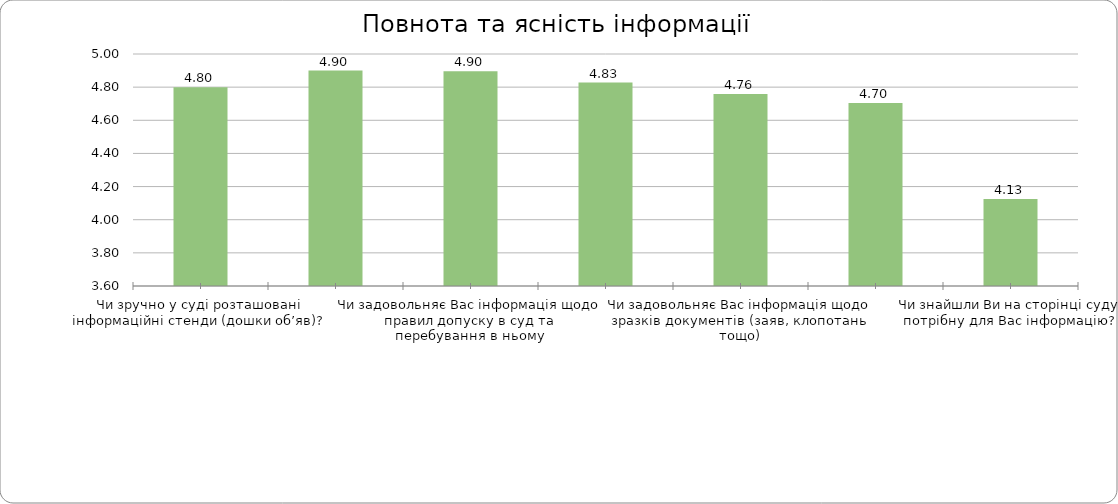
| Category | Series 0 |
|---|---|
| Чи зручно у суді розташовані інформаційні стенди (дошки об’яв)? | 4.8 |
| Чи задовольняє Вас інформація щодо розташування кабінетів, залів судових засідань, інших приміщень | 4.9 |
| Чи задовольняє Вас інформація щодо правил допуску в суд та перебування в ньому | 4.897 |
| Чи задовольняє Вас інформація щодо справ, що призначені до розгляду | 4.828 |
| Чи задовольняє Вас інформація щодо зразків документів (заяв, клопотань тощо) | 4.759 |
| Чи задовольняє Вас інформація щодо порядку сплати судових зборів та мита, реквізити та розміри платежів | 4.704 |
| Чи знайшли Ви на сторінці суду потрібну для Вас інформацію? | 4.125 |